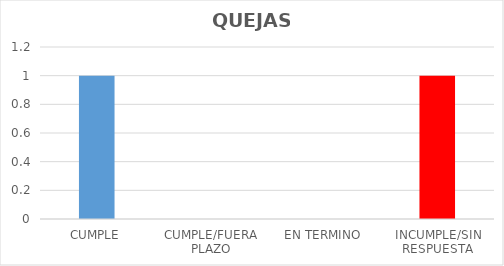
| Category | TOTAL |
|---|---|
| CUMPLE | 1 |
| CUMPLE/FUERA PLAZO | 0 |
| EN TERMINO | 0 |
| INCUMPLE/SIN RESPUESTA | 1 |